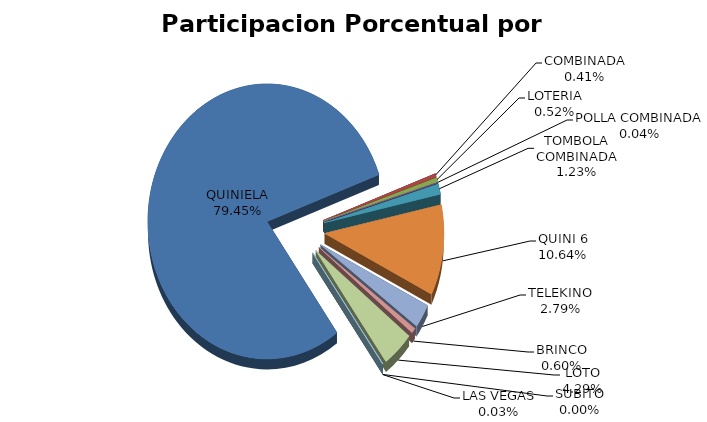
| Category | Series 0 |
|---|---|
| QUINIELA | 30432610.286 |
| COMBINADA | 157204.31 |
| LOTERIA | 198175.712 |
| POLLA COMBINADA | 13899.05 |
| TOMBOLA COMBINADA | 472396.5 |
| QUINI 6 | 4074723.29 |
| TELEKINO | 1068947.1 |
| BRINCO | 229262.374 |
| LOTO | 1644294.78 |
| SUBITO | 0 |
| LAS VEGAS | 12530.52 |